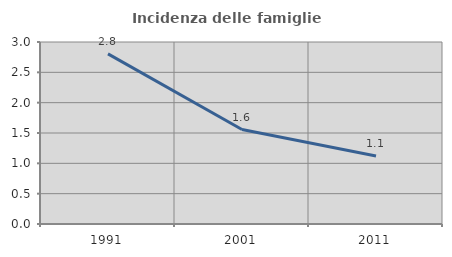
| Category | Incidenza delle famiglie numerose |
|---|---|
| 1991.0 | 2.805 |
| 2001.0 | 1.557 |
| 2011.0 | 1.12 |